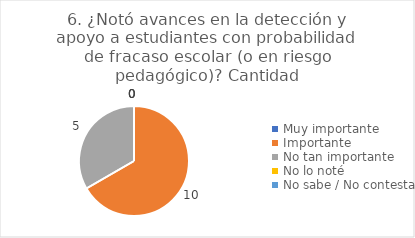
| Category | 6. ¿Notó avances en la detección y apoyo a estudiantes con probabilidad de fracaso escolar (o en riesgo pedagógico)? |
|---|---|
| Muy importante  | 0 |
| Importante  | 0.667 |
| No tan importante  | 0.333 |
| No lo noté  | 0 |
| No sabe / No contesta | 0 |